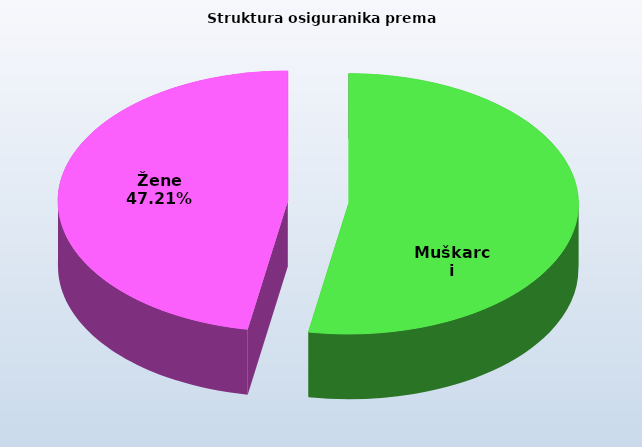
| Category | Series 0 |
|---|---|
| Muškarci | 814214 |
| Žene | 728114 |